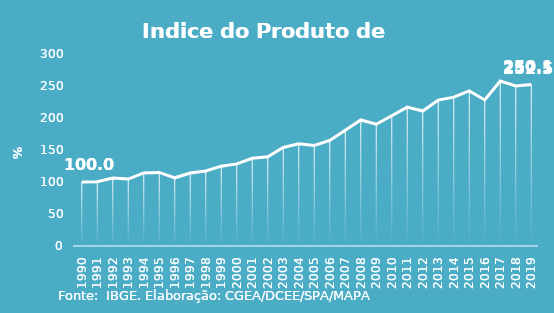
| Category | Indice de Prod. base 1990 |
|---|---|
| 1990.0 | 100 |
| 1991.0 | 100.275 |
| 1992.0 | 106.203 |
| 1993.0 | 104.57 |
| 1994.0 | 114.164 |
| 1995.0 | 115.024 |
| 1996.0 | 106.552 |
| 1997.0 | 114.037 |
| 1998.0 | 117.319 |
| 1999.0 | 124.734 |
| 2000.0 | 128.293 |
| 2001.0 | 136.975 |
| 2002.0 | 139.51 |
| 2003.0 | 153.868 |
| 2004.0 | 159.641 |
| 2005.0 | 157.136 |
| 2006.0 | 164.858 |
| 2007.0 | 180.781 |
| 2008.0 | 196.91 |
| 2009.0 | 190.309 |
| 2010.0 | 203.581 |
| 2011.0 | 217.041 |
| 2012.0 | 210.932 |
| 2013.0 | 228.009 |
| 2014.0 | 232.562 |
| 2015.0 | 242.318 |
| 2016.0 | 228.239 |
| 2017.0 | 257.766 |
| 2018.0 | 250.124 |
| 2019.0 | 252.518 |